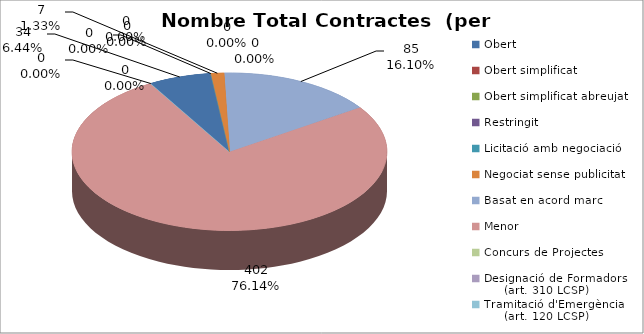
| Category | Nombre Total Contractes |
|---|---|
| Obert | 34 |
| Obert simplificat | 0 |
| Obert simplificat abreujat | 0 |
| Restringit | 0 |
| Licitació amb negociació | 0 |
| Negociat sense publicitat | 7 |
| Basat en acord marc | 85 |
| Menor | 402 |
| Concurs de Projectes | 0 |
| Designació de Formadors
     (art. 310 LCSP) | 0 |
| Tramitació d'Emergència
     (art. 120 LCSP) | 0 |